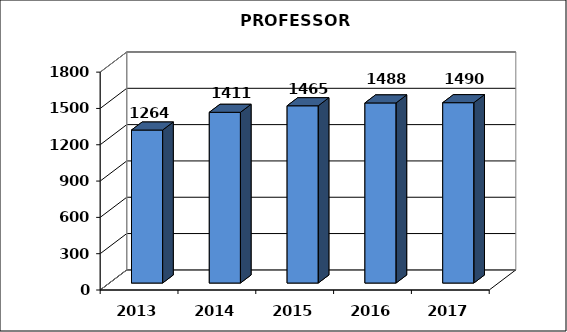
| Category | Series 0 |
|---|---|
| 2013 | 1264 |
| 2014 | 1410.5 |
| 2015 | 1464.5 |
| 2016 | 1488 |
| 2017 | 1490 |